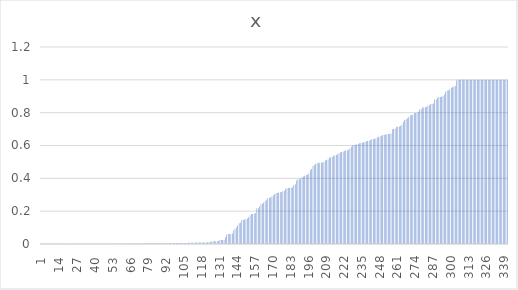
| Category | x |
|---|---|
| 1.0 | 0.001 |
| 2.0 | 0.001 |
| 3.0 | 0.001 |
| 4.0 | 0.001 |
| 5.0 | 0.001 |
| 6.0 | 0.001 |
| 7.0 | 0.001 |
| 8.0 | 0.001 |
| 9.0 | 0.001 |
| 10.0 | 0.001 |
| 11.0 | 0.001 |
| 12.0 | 0.001 |
| 13.0 | 0.001 |
| 14.0 | 0.001 |
| 15.0 | 0.001 |
| 16.0 | 0.001 |
| 17.0 | 0.001 |
| 18.0 | 0.001 |
| 19.0 | 0.001 |
| 20.0 | 0.001 |
| 21.0 | 0.001 |
| 22.0 | 0.001 |
| 23.0 | 0.001 |
| 24.0 | 0.002 |
| 25.0 | 0.002 |
| 26.0 | 0.002 |
| 27.0 | 0.002 |
| 28.0 | 0.002 |
| 29.0 | 0.002 |
| 30.0 | 0.002 |
| 31.0 | 0.002 |
| 32.0 | 0.002 |
| 33.0 | 0.002 |
| 34.0 | 0.002 |
| 35.0 | 0.002 |
| 36.0 | 0.002 |
| 37.0 | 0.002 |
| 38.0 | 0.002 |
| 39.0 | 0.002 |
| 40.0 | 0.002 |
| 41.0 | 0.002 |
| 42.0 | 0.002 |
| 43.0 | 0.002 |
| 44.0 | 0.002 |
| 45.0 | 0.002 |
| 46.0 | 0.002 |
| 47.0 | 0.002 |
| 48.0 | 0.002 |
| 49.0 | 0.002 |
| 50.0 | 0.002 |
| 51.0 | 0.002 |
| 52.0 | 0.002 |
| 53.0 | 0.002 |
| 54.0 | 0.002 |
| 55.0 | 0.002 |
| 56.0 | 0.002 |
| 57.0 | 0.002 |
| 58.0 | 0.003 |
| 59.0 | 0.003 |
| 60.0 | 0.003 |
| 61.0 | 0.003 |
| 62.0 | 0.003 |
| 63.0 | 0.003 |
| 64.0 | 0.003 |
| 65.0 | 0.003 |
| 66.0 | 0.003 |
| 67.0 | 0.003 |
| 68.0 | 0.003 |
| 69.0 | 0.003 |
| 70.0 | 0.003 |
| 71.0 | 0.003 |
| 72.0 | 0.003 |
| 73.0 | 0.003 |
| 74.0 | 0.003 |
| 75.0 | 0.004 |
| 76.0 | 0.004 |
| 77.0 | 0.004 |
| 78.0 | 0.004 |
| 79.0 | 0.004 |
| 80.0 | 0.004 |
| 81.0 | 0.004 |
| 82.0 | 0.004 |
| 83.0 | 0.004 |
| 84.0 | 0.004 |
| 85.0 | 0.004 |
| 86.0 | 0.004 |
| 87.0 | 0.004 |
| 88.0 | 0.004 |
| 89.0 | 0.004 |
| 90.0 | 0.005 |
| 91.0 | 0.005 |
| 92.0 | 0.005 |
| 93.0 | 0.005 |
| 94.0 | 0.005 |
| 95.0 | 0.005 |
| 96.0 | 0.005 |
| 97.0 | 0.005 |
| 98.0 | 0.005 |
| 99.0 | 0.005 |
| 100.0 | 0.006 |
| 101.0 | 0.006 |
| 102.0 | 0.006 |
| 103.0 | 0.006 |
| 104.0 | 0.006 |
| 105.0 | 0.006 |
| 106.0 | 0.007 |
| 107.0 | 0.007 |
| 108.0 | 0.007 |
| 109.0 | 0.007 |
| 110.0 | 0.007 |
| 111.0 | 0.007 |
| 112.0 | 0.008 |
| 113.0 | 0.008 |
| 114.0 | 0.009 |
| 115.0 | 0.009 |
| 116.0 | 0.009 |
| 117.0 | 0.009 |
| 118.0 | 0.009 |
| 119.0 | 0.009 |
| 120.0 | 0.01 |
| 121.0 | 0.01 |
| 122.0 | 0.01 |
| 123.0 | 0.011 |
| 124.0 | 0.013 |
| 125.0 | 0.014 |
| 126.0 | 0.015 |
| 127.0 | 0.017 |
| 128.0 | 0.017 |
| 129.0 | 0.017 |
| 130.0 | 0.017 |
| 131.0 | 0.018 |
| 132.0 | 0.025 |
| 133.0 | 0.025 |
| 134.0 | 0.025 |
| 135.0 | 0.026 |
| 136.0 | 0.041 |
| 137.0 | 0.058 |
| 138.0 | 0.06 |
| 139.0 | 0.061 |
| 140.0 | 0.061 |
| 141.0 | 0.064 |
| 142.0 | 0.082 |
| 143.0 | 0.093 |
| 144.0 | 0.1 |
| 145.0 | 0.115 |
| 146.0 | 0.126 |
| 147.0 | 0.13 |
| 148.0 | 0.147 |
| 149.0 | 0.148 |
| 150.0 | 0.15 |
| 151.0 | 0.15 |
| 152.0 | 0.155 |
| 153.0 | 0.162 |
| 154.0 | 0.173 |
| 155.0 | 0.183 |
| 156.0 | 0.183 |
| 157.0 | 0.185 |
| 158.0 | 0.19 |
| 159.0 | 0.217 |
| 160.0 | 0.218 |
| 161.0 | 0.228 |
| 162.0 | 0.241 |
| 163.0 | 0.246 |
| 164.0 | 0.251 |
| 165.0 | 0.261 |
| 166.0 | 0.269 |
| 167.0 | 0.278 |
| 168.0 | 0.282 |
| 169.0 | 0.283 |
| 170.0 | 0.29 |
| 171.0 | 0.297 |
| 172.0 | 0.305 |
| 173.0 | 0.31 |
| 174.0 | 0.31 |
| 175.0 | 0.313 |
| 176.0 | 0.316 |
| 177.0 | 0.316 |
| 178.0 | 0.322 |
| 179.0 | 0.324 |
| 180.0 | 0.337 |
| 181.0 | 0.34 |
| 182.0 | 0.342 |
| 183.0 | 0.342 |
| 184.0 | 0.343 |
| 185.0 | 0.345 |
| 186.0 | 0.359 |
| 187.0 | 0.365 |
| 188.0 | 0.387 |
| 189.0 | 0.395 |
| 190.0 | 0.395 |
| 191.0 | 0.399 |
| 192.0 | 0.407 |
| 193.0 | 0.411 |
| 194.0 | 0.416 |
| 195.0 | 0.421 |
| 196.0 | 0.422 |
| 197.0 | 0.431 |
| 198.0 | 0.451 |
| 199.0 | 0.458 |
| 200.0 | 0.475 |
| 201.0 | 0.481 |
| 202.0 | 0.489 |
| 203.0 | 0.491 |
| 204.0 | 0.494 |
| 205.0 | 0.494 |
| 206.0 | 0.496 |
| 207.0 | 0.497 |
| 208.0 | 0.501 |
| 209.0 | 0.511 |
| 210.0 | 0.512 |
| 211.0 | 0.517 |
| 212.0 | 0.527 |
| 213.0 | 0.528 |
| 214.0 | 0.531 |
| 215.0 | 0.538 |
| 216.0 | 0.539 |
| 217.0 | 0.542 |
| 218.0 | 0.546 |
| 219.0 | 0.553 |
| 220.0 | 0.559 |
| 221.0 | 0.561 |
| 222.0 | 0.564 |
| 223.0 | 0.567 |
| 224.0 | 0.571 |
| 225.0 | 0.571 |
| 226.0 | 0.574 |
| 227.0 | 0.582 |
| 228.0 | 0.592 |
| 229.0 | 0.6 |
| 230.0 | 0.603 |
| 231.0 | 0.604 |
| 232.0 | 0.606 |
| 233.0 | 0.609 |
| 234.0 | 0.614 |
| 235.0 | 0.616 |
| 236.0 | 0.616 |
| 237.0 | 0.619 |
| 238.0 | 0.62 |
| 239.0 | 0.627 |
| 240.0 | 0.628 |
| 241.0 | 0.63 |
| 242.0 | 0.633 |
| 243.0 | 0.639 |
| 244.0 | 0.64 |
| 245.0 | 0.64 |
| 246.0 | 0.643 |
| 247.0 | 0.648 |
| 248.0 | 0.653 |
| 249.0 | 0.655 |
| 250.0 | 0.66 |
| 251.0 | 0.665 |
| 252.0 | 0.665 |
| 253.0 | 0.666 |
| 254.0 | 0.67 |
| 255.0 | 0.67 |
| 256.0 | 0.671 |
| 257.0 | 0.674 |
| 258.0 | 0.699 |
| 259.0 | 0.7 |
| 260.0 | 0.702 |
| 261.0 | 0.713 |
| 262.0 | 0.715 |
| 263.0 | 0.716 |
| 264.0 | 0.718 |
| 265.0 | 0.727 |
| 266.0 | 0.744 |
| 267.0 | 0.756 |
| 268.0 | 0.76 |
| 269.0 | 0.766 |
| 270.0 | 0.772 |
| 271.0 | 0.785 |
| 272.0 | 0.786 |
| 273.0 | 0.787 |
| 274.0 | 0.797 |
| 275.0 | 0.798 |
| 276.0 | 0.8 |
| 277.0 | 0.806 |
| 278.0 | 0.82 |
| 279.0 | 0.821 |
| 280.0 | 0.831 |
| 281.0 | 0.832 |
| 282.0 | 0.832 |
| 283.0 | 0.836 |
| 284.0 | 0.842 |
| 285.0 | 0.845 |
| 286.0 | 0.853 |
| 287.0 | 0.853 |
| 288.0 | 0.856 |
| 289.0 | 0.88 |
| 290.0 | 0.881 |
| 291.0 | 0.89 |
| 292.0 | 0.895 |
| 293.0 | 0.896 |
| 294.0 | 0.898 |
| 295.0 | 0.9 |
| 296.0 | 0.91 |
| 297.0 | 0.927 |
| 298.0 | 0.935 |
| 299.0 | 0.936 |
| 300.0 | 0.943 |
| 301.0 | 0.953 |
| 302.0 | 0.955 |
| 303.0 | 0.959 |
| 304.0 | 0.962 |
| 305.0 | 0.995 |
| 306.0 | 1 |
| 307.0 | 1 |
| 308.0 | 1 |
| 309.0 | 1 |
| 310.0 | 1 |
| 311.0 | 1 |
| 312.0 | 1 |
| 313.0 | 1 |
| 314.0 | 1 |
| 315.0 | 1 |
| 316.0 | 1 |
| 317.0 | 1 |
| 318.0 | 1 |
| 319.0 | 1 |
| 320.0 | 1 |
| 321.0 | 1 |
| 322.0 | 1 |
| 323.0 | 1 |
| 324.0 | 1 |
| 325.0 | 1 |
| 326.0 | 1 |
| 327.0 | 1 |
| 328.0 | 1 |
| 329.0 | 1 |
| 330.0 | 1 |
| 331.0 | 1 |
| 332.0 | 1 |
| 333.0 | 1 |
| 334.0 | 1 |
| 335.0 | 1 |
| 336.0 | 1 |
| 337.0 | 1 |
| 338.0 | 1 |
| 339.0 | 1 |
| 340.0 | 1 |
| 341.0 | 1 |
| 342.0 | 1 |